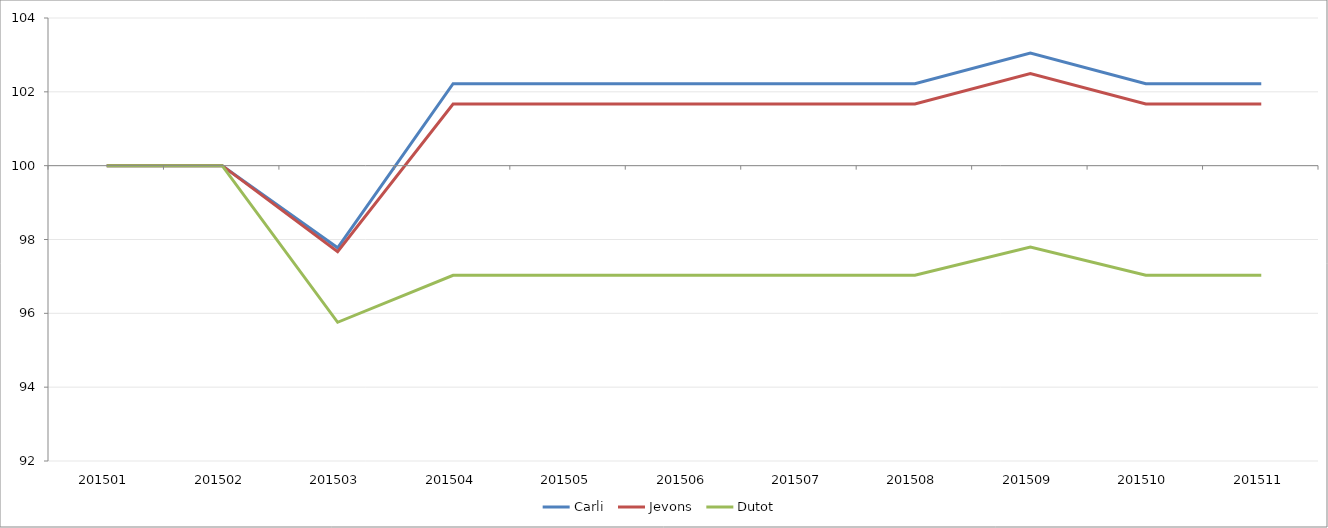
| Category | Carli | Jevons | Dutot |
|---|---|---|---|
| 201501.0 | 100 | 100 | 100 |
| 201502.0 | 100 | 100 | 100 |
| 201503.0 | 97.775 | 97.669 | 95.757 |
| 201504.0 | 102.22 | 101.669 | 97.03 |
| 201505.0 | 102.22 | 101.669 | 97.03 |
| 201506.0 | 102.22 | 101.669 | 97.03 |
| 201507.0 | 102.22 | 101.669 | 97.03 |
| 201508.0 | 102.22 | 101.669 | 97.03 |
| 201509.0 | 103.047 | 102.497 | 97.794 |
| 201510.0 | 102.22 | 101.669 | 97.03 |
| 201511.0 | 102.22 | 101.669 | 97.03 |